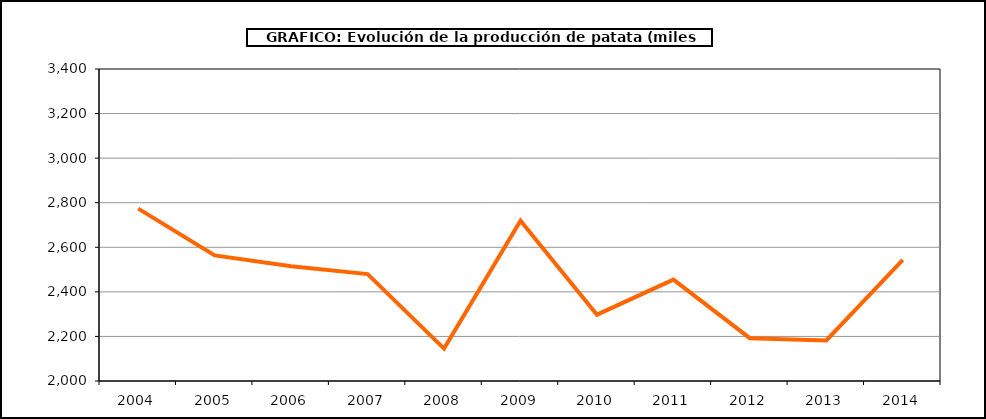
| Category | Producción |
|---|---|
| 2004.0 | 2773.567 |
| 2005.0 | 2563.464 |
| 2006.0 | 2515.001 |
| 2007.0 | 2479.582 |
| 2008.0 | 2145.171 |
| 2009.0 | 2719.291 |
| 2010.0 | 2297.649 |
| 2011.0 | 2455.101 |
| 2012.0 | 2192.284 |
| 2013.0 | 2182.082 |
| 2014.0 | 2544.009 |